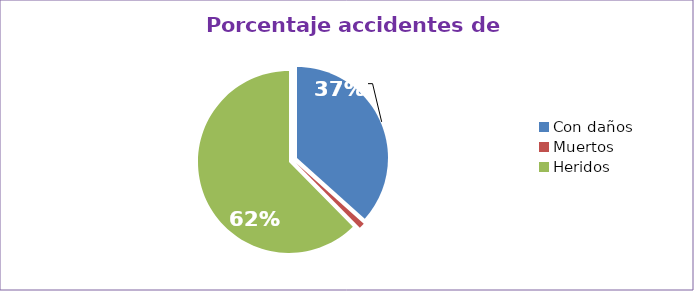
| Category | Series 0 |
|---|---|
| Con daños  | 36.634 |
| Muertos  | 0.99 |
| Heridos  | 62.376 |